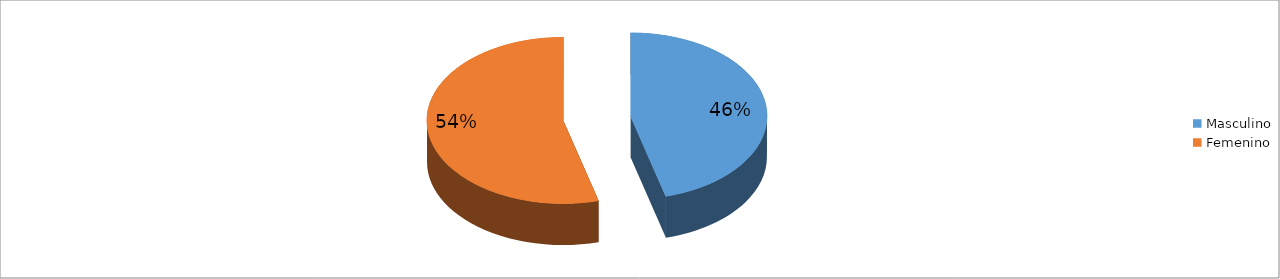
| Category | Series 0 |
|---|---|
| Masculino | 0.458 |
| Femenino | 0.542 |